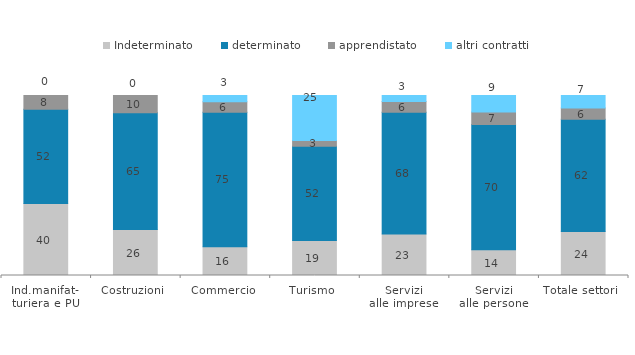
| Category | Indeterminato | determinato | apprendistato | altri contratti |
|---|---|---|---|---|
| Ind.manifat-
turiera e PU | 39.958 | 52.458 | 7.584 | 0 |
| Costruzioni | 25.532 | 64.894 | 9.574 | 0 |
| Commercio | 16.015 | 74.704 | 5.823 | 3.458 |
| Turismo | 19.489 | 52.255 | 3.319 | 24.936 |
| Servizi
alle imprese | 23.038 | 67.66 | 5.959 | 3.343 |
| Servizi
alle persone | 14.309 | 69.551 | 6.988 | 9.151 |
| Totale settori | 24.379 | 62.462 | 6.235 | 6.924 |